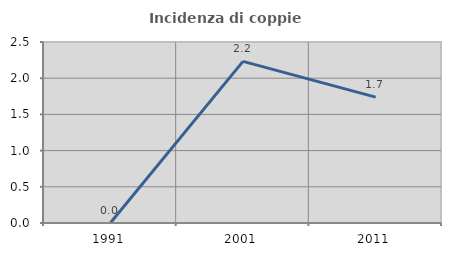
| Category | Incidenza di coppie miste |
|---|---|
| 1991.0 | 0 |
| 2001.0 | 2.232 |
| 2011.0 | 1.739 |